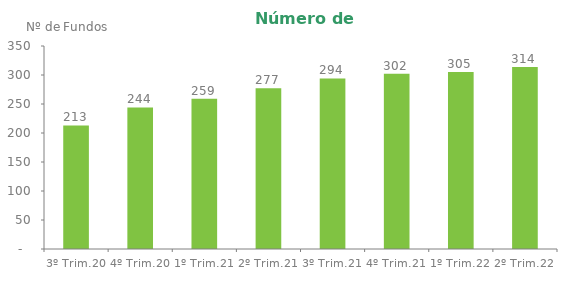
| Category | Series 0 |
|---|---|
| 3º Trim.20 | 213 |
| 4º Trim.20 | 244 |
| 1º Trim.21 | 259 |
| 2º Trim.21 | 277 |
| 3º Trim.21 | 294 |
| 4º Trim.21 | 302 |
| 1º Trim.22 | 305 |
| 2º Trim.22 | 314 |